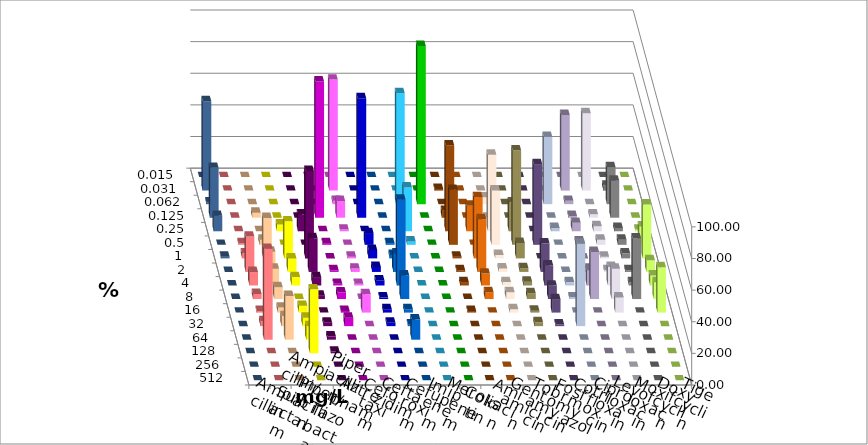
| Category | Ampicillin | Ampicillin/ Sulbactam | Piperacillin | Piperacillin/ Tazobactam | Aztreonam | Cefotaxim | Ceftazidim | Cefuroxim | Imipenem | Meropenem | Colistin | Amikacin | Gentamicin | Tobramycin | Fosfomycin | Cotrimoxazol | Ciprofloxacin | Levofloxacin | Moxifloxacin | Doxycyclin | Tigecyclin |
|---|---|---|---|---|---|---|---|---|---|---|---|---|---|---|---|---|---|---|---|---|---|
| 0.015 | 0 | 0 | 0 | 0 | 0 | 0 | 0 | 0 | 0 | 0 | 0 | 0 | 0 | 0 | 0 | 0 | 0 | 0 | 0 | 0 | 0 |
| 0.031 | 0 | 0 | 0 | 0 | 0 | 70.213 | 0 | 0 | 0 | 0 | 1.087 | 0 | 0 | 0 | 0 | 0 | 47.872 | 48.936 | 3.191 | 0 | 56.522 |
| 0.062 | 0 | 0 | 0 | 0 | 0 | 2.128 | 0 | 0 | 70.213 | 100 | 0 | 0 | 4.301 | 0 | 0 | 42.553 | 2.128 | 0 | 23.404 | 0 | 1.087 |
| 0.125 | 0 | 3.191 | 0 | 0 | 86.17 | 10.638 | 75.532 | 0 | 0 | 0 | 4.348 | 0 | 0 | 0 | 0 | 0 | 1.064 | 2.128 | 23.404 | 0 | 31.522 |
| 0.25 | 0 | 0 | 4.255 | 10.638 | 0 | 1.064 | 0 | 0 | 27.66 | 0 | 54.348 | 16.129 | 48.387 | 18.293 | 0 | 2.128 | 5.319 | 3.191 | 2.128 | 1.064 | 9.783 |
| 0.5 | 1.064 | 3.191 | 0 | 0 | 1.064 | 0 | 7.447 | 1.064 | 2.128 | 0 | 34.783 | 0 | 34.409 | 59.756 | 51.064 | 0 | 2.128 | 3.191 | 3.191 | 11.702 | 0 |
| 1.0 | 3.191 | 25.532 | 23.404 | 55.319 | 0 | 1.064 | 5.319 | 2.128 | 0 | 0 | 1.087 | 38.71 | 2.151 | 9.756 | 0 | 0 | 0 | 1.064 | 3.191 | 34.043 | 1.087 |
| 2.0 | 22.34 | 12.766 | 8.511 | 21.277 | 1.064 | 2.128 | 3.191 | 11.702 | 0 | 0 | 1.087 | 33.333 | 2.151 | 2.439 | 18.085 | 0 | 2.128 | 1.064 | 1.064 | 7.447 | 0 |
| 4.0 | 8.511 | 10.638 | 5.319 | 5.319 | 1.064 | 1.064 | 3.191 | 54.255 | 0 | 0 | 2.174 | 7.527 | 2.151 | 2.439 | 12.766 | 2.128 | 9.574 | 11.702 | 2.128 | 6.383 | 0 |
| 8.0 | 3.191 | 7.447 | 0 | 2.128 | 4.255 | 0 | 1.064 | 14.894 | 0 | 0 | 0 | 4.301 | 4.301 | 3.659 | 8.511 | 1.064 | 29.787 | 19.149 | 38.298 | 10.638 | 0 |
| 16.0 | 1.064 | 3.191 | 4.255 | 0 | 1.064 | 11.702 | 2.128 | 2.128 | 0 | 0 | 1.087 | 0 | 2.151 | 1.22 | 8.511 | 0 | 0 | 9.574 | 0 | 28.723 | 0 |
| 32.0 | 3.191 | 6.383 | 5.319 | 2.128 | 5.319 | 0 | 2.128 | 1.064 | 0 | 0 | 0 | 0 | 0 | 2.439 | 1.064 | 52.128 | 0 | 0 | 0 | 0 | 0 |
| 64.0 | 57.447 | 27.66 | 8.511 | 2.128 | 0 | 0 | 0 | 12.766 | 0 | 0 | 0 | 0 | 0 | 0 | 0 | 0 | 0 | 0 | 0 | 0 | 0 |
| 128.0 | 0 | 0 | 40.426 | 1.064 | 0 | 0 | 0 | 0 | 0 | 0 | 0 | 0 | 0 | 0 | 0 | 0 | 0 | 0 | 0 | 0 | 0 |
| 256.0 | 0 | 0 | 0 | 0 | 0 | 0 | 0 | 0 | 0 | 0 | 0 | 0 | 0 | 0 | 0 | 0 | 0 | 0 | 0 | 0 | 0 |
| 512.0 | 0 | 0 | 0 | 0 | 0 | 0 | 0 | 0 | 0 | 0 | 0 | 0 | 0 | 0 | 0 | 0 | 0 | 0 | 0 | 0 | 0 |